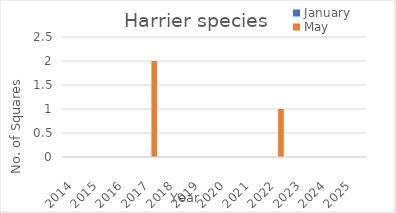
| Category | January | May |
|---|---|---|
| 2014.0 | 0 | 0 |
| 2015.0 | 0 | 0 |
| 2016.0 | 0 | 0 |
| 2017.0 | 0 | 2 |
| 2018.0 | 0 | 0 |
| 2019.0 | 0 | 0 |
| 2020.0 | 0 | 0 |
| 2021.0 | 0 | 0 |
| 2022.0 | 0 | 1 |
| 2023.0 | 0 | 0 |
| 2024.0 | 0 | 0 |
| 2025.0 | 0 | 0 |